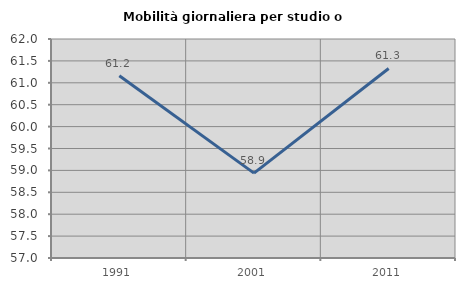
| Category | Mobilità giornaliera per studio o lavoro |
|---|---|
| 1991.0 | 61.163 |
| 2001.0 | 58.938 |
| 2011.0 | 61.327 |